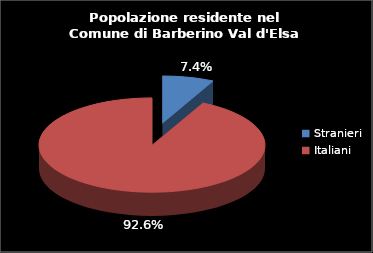
| Category | Series 0 |
|---|---|
| Stranieri | 322 |
| Italiani | 4037 |